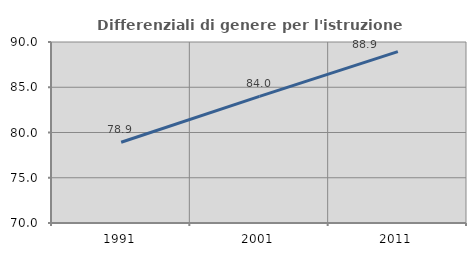
| Category | Differenziali di genere per l'istruzione superiore |
|---|---|
| 1991.0 | 78.918 |
| 2001.0 | 83.99 |
| 2011.0 | 88.933 |